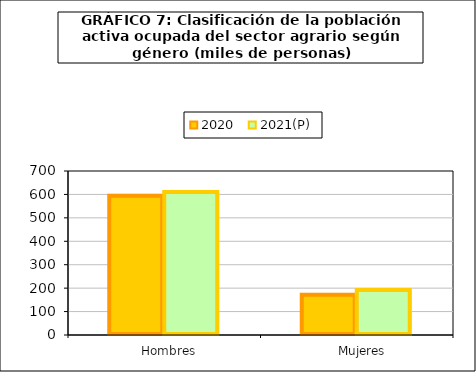
| Category | 2020 | 2021(P) |
|---|---|---|
|    Hombres | 593.875 | 610.725 |
|    Mujeres | 171.425 | 191.925 |